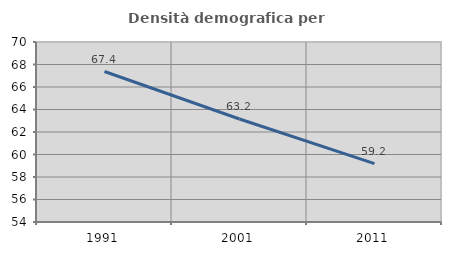
| Category | Densità demografica |
|---|---|
| 1991.0 | 67.374 |
| 2001.0 | 63.155 |
| 2011.0 | 59.183 |